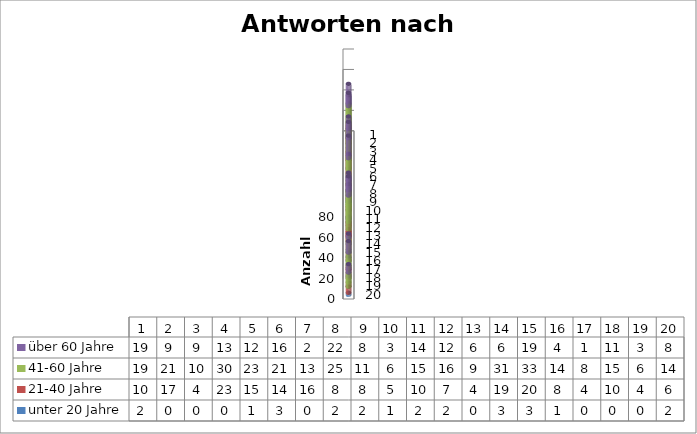
| Category | unter 20 Jahre  | 21-40 Jahre  | 41-60 Jahre  | über 60 Jahre  |
|---|---|---|---|---|
| 0 | 2 | 10 | 19 | 19 |
| 1 | 0 | 17 | 21 | 9 |
| 2 | 0 | 4 | 10 | 9 |
| 3 | 0 | 23 | 30 | 13 |
| 4 | 1 | 15 | 23 | 12 |
| 5 | 3 | 14 | 21 | 16 |
| 6 | 0 | 16 | 13 | 2 |
| 7 | 2 | 8 | 25 | 22 |
| 8 | 2 | 8 | 11 | 8 |
| 9 | 1 | 5 | 6 | 3 |
| 10 | 2 | 10 | 15 | 14 |
| 11 | 2 | 7 | 16 | 12 |
| 12 | 0 | 4 | 9 | 6 |
| 13 | 3 | 19 | 31 | 6 |
| 14 | 3 | 20 | 33 | 19 |
| 15 | 1 | 8 | 14 | 4 |
| 16 | 0 | 4 | 8 | 1 |
| 17 | 0 | 10 | 15 | 11 |
| 18 | 0 | 4 | 6 | 3 |
| 19 | 2 | 6 | 14 | 8 |